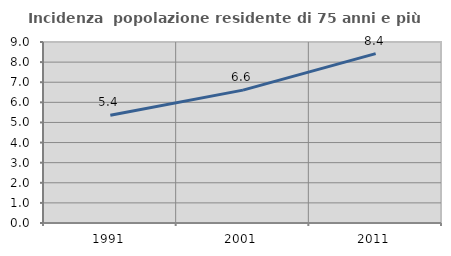
| Category | Incidenza  popolazione residente di 75 anni e più |
|---|---|
| 1991.0 | 5.356 |
| 2001.0 | 6.608 |
| 2011.0 | 8.419 |